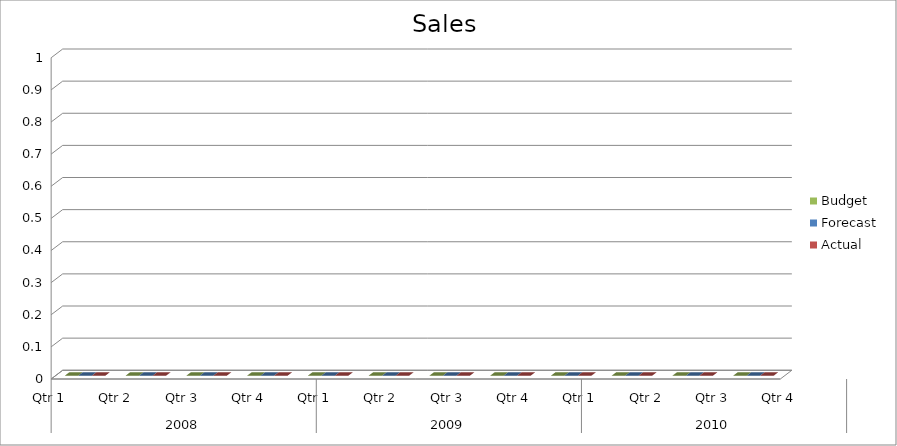
| Category | Budget | Forecast | Actual |
|---|---|---|---|
| 0 | 1360 | 2130 | 1440 |
| 1 | 880 | 3120 | 3260 |
| 2 | 1580 | 1780 | 2000 |
| 3 | 2580 | 1750 | 2200 |
| 4 | 2350 | 2820 | 1600 |
| 5 | 2780 | 3360 | 3270 |
| 6 | 2870 | 1140 | 1310 |
| 7 | 1430 | 3060 | 3200 |
| 8 | 1120 | 3460 | 3050 |
| 9 | 1860 | 520 | 1130 |
| 10 | 2920 | 760 | 1630 |
| 11 | 1340 | 1280 | 3310 |